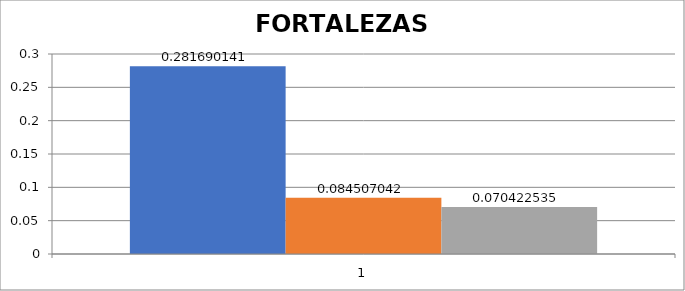
| Category | Conocimiento y experiencia de personal vinculado al proceso-Disposición del personal- Compromiso del recurso humano-Buenas relaciones entre los miembros de algunos equipos de trabajo  | Compromiso por parte de la alta Dirección |  Implementación del sistema de gestión de la calidad y el modelo estándar de control interno MECI.  |
|---|---|---|---|
| 0 | 0.282 | 0.085 | 0.07 |